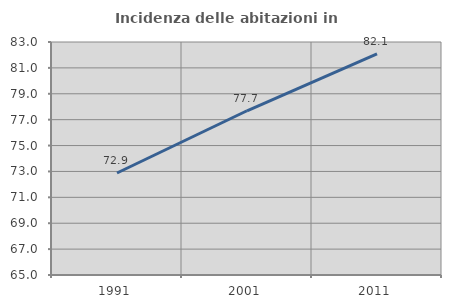
| Category | Incidenza delle abitazioni in proprietà  |
|---|---|
| 1991.0 | 72.881 |
| 2001.0 | 77.689 |
| 2011.0 | 82.081 |